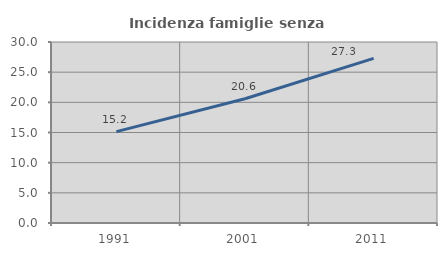
| Category | Incidenza famiglie senza nuclei |
|---|---|
| 1991.0 | 15.152 |
| 2001.0 | 20.594 |
| 2011.0 | 27.288 |